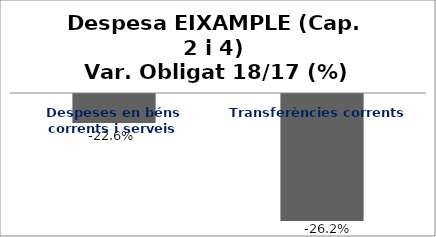
| Category | Series 0 |
|---|---|
| Despeses en béns corrents i serveis | -0.226 |
| Transferències corrents | -0.262 |